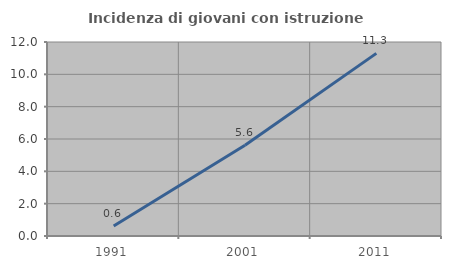
| Category | Incidenza di giovani con istruzione universitaria |
|---|---|
| 1991.0 | 0.621 |
| 2001.0 | 5.618 |
| 2011.0 | 11.297 |